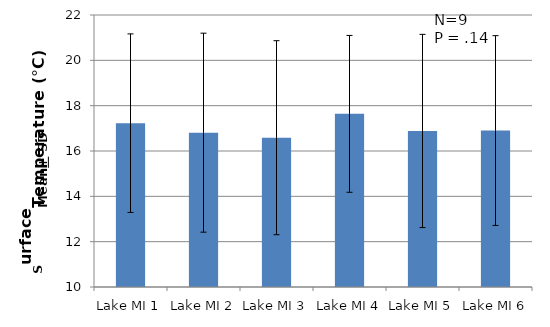
| Category | Series 0 |
|---|---|
| Lake MI 1 | 17.228 |
| Lake MI 2 | 16.809 |
| Lake MI 3 | 16.587 |
| Lake MI 4 | 17.639 |
| Lake MI 5 | 16.884 |
| Lake MI 6 | 16.902 |